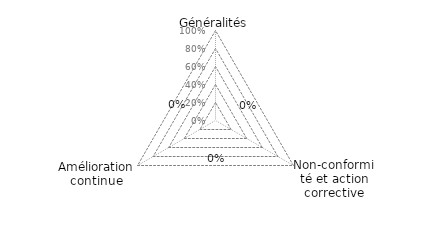
| Category | Art 10 |
|---|---|
| 0 | 0 |
| 1 | 0 |
| 2 | 0 |